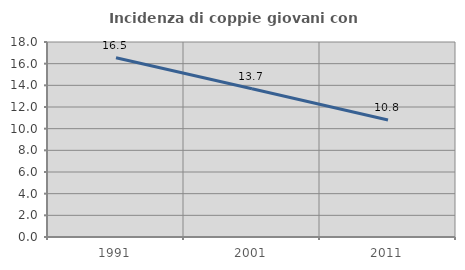
| Category | Incidenza di coppie giovani con figli |
|---|---|
| 1991.0 | 16.541 |
| 2001.0 | 13.684 |
| 2011.0 | 10.794 |